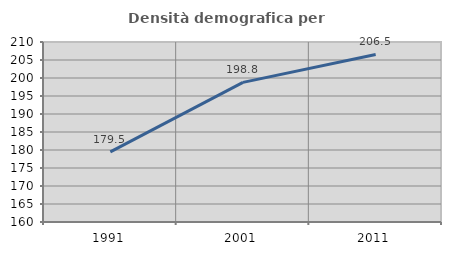
| Category | Densità demografica |
|---|---|
| 1991.0 | 179.473 |
| 2001.0 | 198.788 |
| 2011.0 | 206.542 |